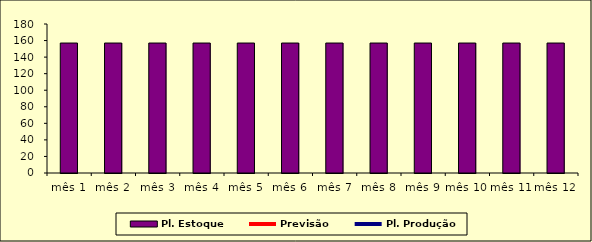
| Category | Pl. Estoque |
|---|---|
| mês 1 | 157 |
| mês 2 | 157 |
| mês 3 | 157 |
| mês 4 | 157 |
| mês 5 | 157 |
| mês 6 | 157 |
| mês 7 | 157 |
| mês 8 | 157 |
| mês 9 | 157 |
| mês 10 | 157 |
| mês 11 | 157 |
| mês 12 | 157 |